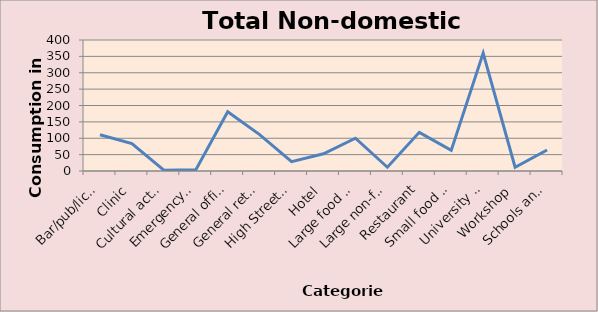
| Category | Total Non-domestic Consumption |
|---|---|
| Bar/pub/licensed club | 110.76 |
| Clinic | 84 |
| Cultural activities | 2.66 |
| Emergency services | 3.5 |
| General office | 181.165 |
| General retail | 111.045 |
| High Street agency | 28.42 |
| Hotel | 52.5 |
| Large food store | 100 |
| Large non-food shop | 11.48 |
| Restaurant | 117.99 |
| Small food store | 62.93 |
| University campus | 360 |
| Workshop | 11.55 |
| Schools and seasonal public buildings | 64 |